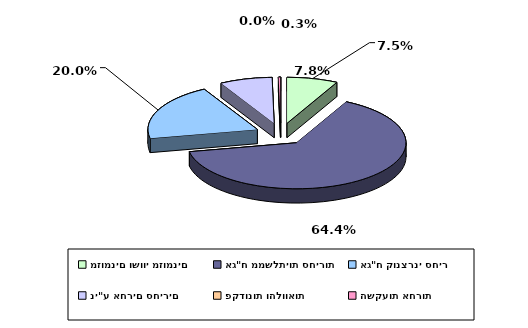
| Category | Series 0 |
|---|---|
| מזומנים ושווי מזומנים | 0.075 |
| אג"ח ממשלתיות סחירות | 0.644 |
| אג"ח קונצרני סחיר | 0.2 |
| ני"ע אחרים סחירים | 0.078 |
| פקדונות והלוואות | 0 |
| השקעות אחרות | 0.003 |